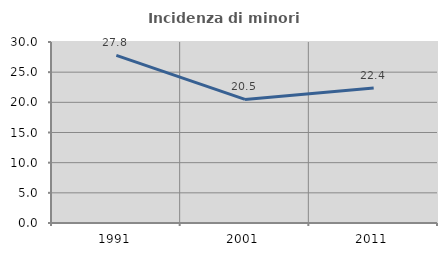
| Category | Incidenza di minori stranieri |
|---|---|
| 1991.0 | 27.778 |
| 2001.0 | 20.482 |
| 2011.0 | 22.38 |